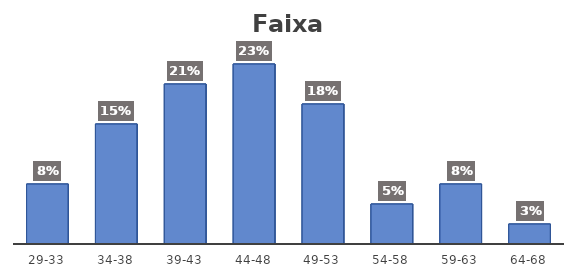
| Category | Series 0 |
|---|---|
| 29-33 | 0.077 |
| 34-38 | 0.154 |
| 39-43 | 0.205 |
| 44-48 | 0.231 |
| 49-53 | 0.179 |
| 54-58 | 0.051 |
| 59-63 | 0.077 |
| 64-68 | 0.026 |